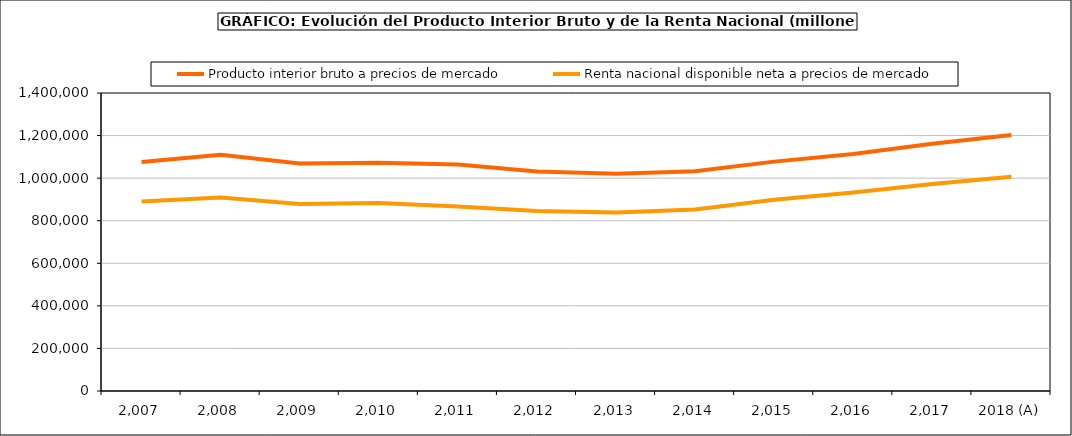
| Category | Producto interior bruto a precios de mercado | Renta nacional disponible neta a precios de mercado |
|---|---|---|
| 2,007 | 1075539 | 890711 |
| 2,008 | 1109541 | 909437 |
| 2,009 | 1069323 | 878214 |
| 2,010 | 1072709 | 882934 |
| 2,011 | 1063763 | 867238 |
| 2,012 | 1031099 | 845973 |
| 2,013 | 1020348 | 838494 |
| 2,014 | 1032158 | 853217 |
| 2,015 | 1077590 | 897955 |
| 2,016 | 1113840 | 932147 |
| 2,017 | 1161878 | 971999 |
| 2018 (A) | 1202193 | 1006768 |